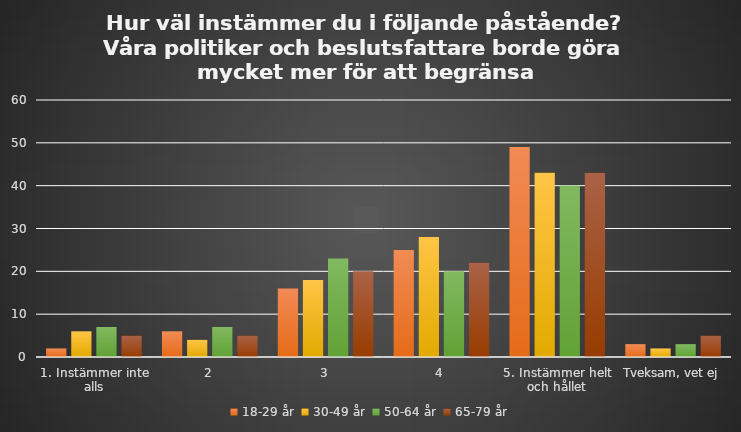
| Category | 18-29 år | 30-49 år | 50-64 år | 65-79 år |
|---|---|---|---|---|
| 1. Instämmer inte alls | 2 | 6 | 7 | 5 |
| 2 | 6 | 4 | 7 | 5 |
| 3 | 16 | 18 | 23 | 20 |
| 4 | 25 | 28 | 20 | 22 |
| 5. Instämmer helt och hållet | 49 | 43 | 40 | 43 |
| Tveksam, vet ej | 3 | 2 | 3 | 5 |